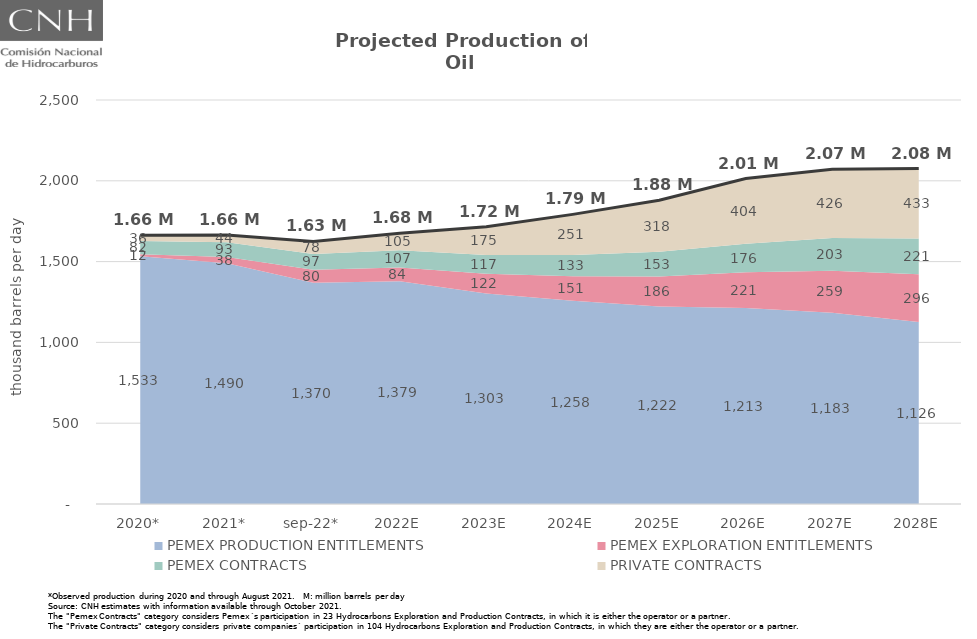
| Category | Total |
|---|---|
| 2020* | 1663.067 |
| 2021* | 1664.715 |
| sep-22* | 1625.017 |
| 2022E | 1675.365 |
| 2023E | 1716.232 |
| 2024E | 1792.31 |
| 2025E | 1879.227 |
| 2026E | 2013.86 |
| 2027E | 2071.645 |
| 2028E | 2075.945 |